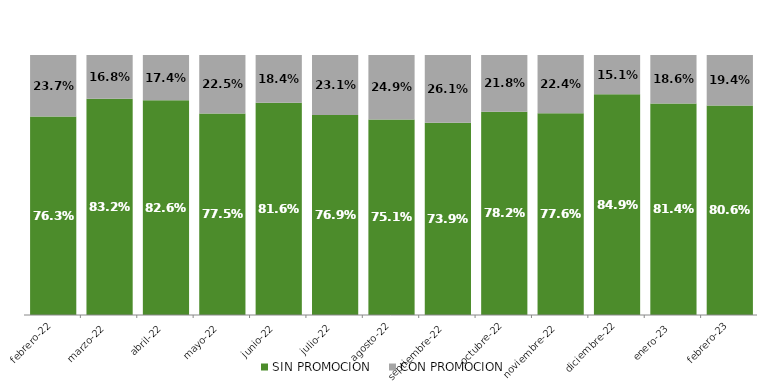
| Category | SIN PROMOCION   | CON PROMOCION   |
|---|---|---|
| 2022-02-01 | 0.763 | 0.237 |
| 2022-03-01 | 0.832 | 0.168 |
| 2022-04-01 | 0.826 | 0.174 |
| 2022-05-01 | 0.775 | 0.225 |
| 2022-06-01 | 0.816 | 0.184 |
| 2022-07-01 | 0.769 | 0.231 |
| 2022-08-01 | 0.751 | 0.249 |
| 2022-09-01 | 0.739 | 0.261 |
| 2022-10-01 | 0.782 | 0.218 |
| 2022-11-01 | 0.776 | 0.224 |
| 2022-12-01 | 0.849 | 0.151 |
| 2023-01-01 | 0.814 | 0.186 |
| 2023-02-01 | 0.806 | 0.194 |